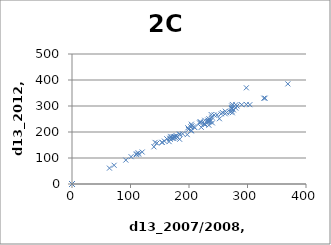
| Category | Series 0 |
|---|---|
| 184.0 | 172 |
| 273.0 | 290 |
| 273.0 | 289 |
| 330.0 | 330 |
| 273.0 | 291 |
| 0.0 | 0 |
| 198.0 | 216 |
| 298.0 | 370 |
| 0.0 | 0 |
| 227.0 | 245 |
| 282.0 | 300 |
| 169.0 | 183 |
| 228.0 | 229 |
| 243.0 | 265 |
| 204.0 | 230 |
| 273.0 | 300 |
| 238.0 | 267 |
| 270.0 | 278 |
| 273.0 | 293 |
| 239.0 | 257 |
| 274.0 | 274 |
| 276.0 | 285 |
| 0.0 | 0 |
| 304.0 | 305 |
| 189.0 | 193 |
| 262.0 | 280 |
| 197.0 | 190 |
| 235.0 | 243 |
| 218.0 | 235 |
| 232.0 | 246 |
| 176.0 | 181 |
| 110.0 | 116 |
| 178.0 | 186 |
| 110.0 | 113 |
| 142.0 | 160 |
| 205.0 | 224 |
| 162.0 | 174 |
| 262.0 | 270 |
| 166.0 | 163 |
| 237.0 | 246 |
| 0.0 | 0 |
| 171.0 | 176 |
| 290.0 | 305 |
| 255.0 | 270 |
| 236.0 | 240 |
| 240.0 | 235 |
| 210.0 | 217 |
| 264.0 | 275 |
| 154.0 | 160 |
| 0.0 | 0 |
| 274.0 | 306 |
| 369.0 | 385 |
| 204.0 | 204 |
| 298.0 | 306 |
| 167.0 | 176 |
| 252.0 | 251 |
| 219.0 | 240 |
| 0.0 | 0 |
| 101.0 | 105 |
| 208.0 | 220 |
| 158.0 | 165 |
| 145.0 | 157 |
| 226.0 | 232 |
| 174.0 | 175 |
| 0.0 | 0 |
| 168.0 | 172 |
| 280.0 | 305 |
| 232.0 | 240 |
| 273.0 | 280 |
| 234.0 | 240 |
| 0.0 | 0 |
| 280.0 | 292 |
| 234.0 | 226 |
| 257.0 | 275 |
| 328.0 | 330 |
| 221.0 | 218 |
| 176.0 | 180 |
| 248.0 | 266 |
| 0.0 | 0 |
| 0.0 | 0 |
| 175.0 | 182 |
| 220.0 | 237 |
| 226.0 | 230 |
| 169.0 | 180 |
| 173.0 | 182 |
| 184.0 | 192 |
| 154.0 | 160 |
| 203.0 | 220 |
| 199.0 | 210 |
| 204.0 | 206 |
| 234.0 | 251 |
| 184.0 | 191 |
| 0.0 | 0 |
| 140.0 | 143 |
| 114.0 | 115 |
| 92.0 | 92 |
| 120.0 | 123 |
| 64.0 | 61 |
| 113.0 | 120 |
| 72.0 | 72 |
| 180.0 | 180 |
| 0.0 | 0 |
| 0.0 | 0 |
| 0.0 | 0 |
| 0.0 | 0 |
| 0.0 | 0 |